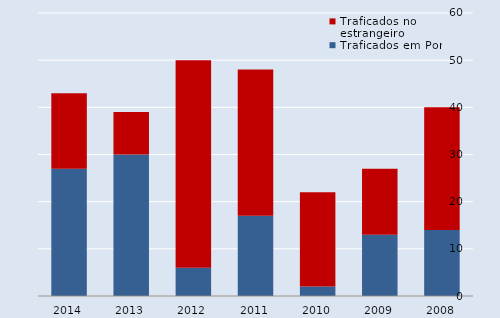
| Category | Traficados em Portugal | Traficados no estrangeiro |
|---|---|---|
| 2008.0 | 14 | 26 |
| 2009.0 | 13 | 14 |
| 2010.0 | 2 | 20 |
| 2011.0 | 17 | 31 |
| 2012.0 | 6 | 44 |
| 2013.0 | 30 | 9 |
| 2014.0 | 27 | 16 |